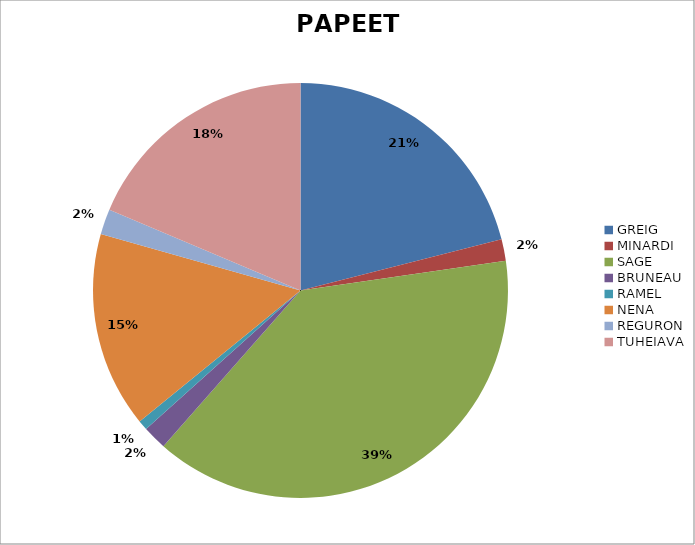
| Category | PAPEETE |
|---|---|
| GREIG | 1402 |
| MINARDI | 112 |
| SAGE | 2586 |
| BRUNEAU | 125 |
| RAMEL | 51 |
| NENA | 1017 |
| REGURON | 132 |
| TUHEIAVA | 1243 |